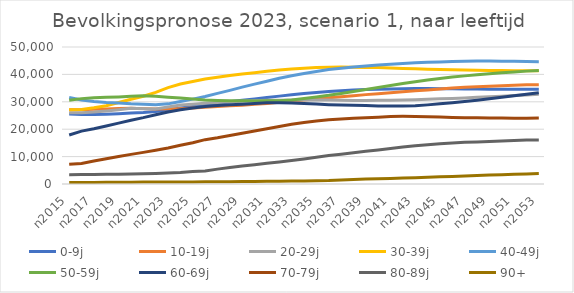
| Category | 0-9j | 10-19j | 20-29j | 30-39j | 40-49j | 50-59j | 60-69j | 70-79j | 80-89j | 90+ |
|---|---|---|---|---|---|---|---|---|---|---|
| n2015 | 25526 | 27094 | 26007 | 27068 | 31578 | 30590 | 17898 | 7209 | 3403 | 562 |
| n2016 | 25325 | 27142 | 26029 | 27207 | 30656 | 31159 | 19295 | 7473 | 3446 | 570 |
| n2017 | 25367 | 27279 | 26249 | 27825 | 30104 | 31476 | 20166 | 8390 | 3483 | 581 |
| n2018 | 25470 | 27389 | 26666 | 28563 | 29717 | 31651 | 21172 | 9244 | 3537 | 622 |
| n2019 | 25660 | 27536 | 27139 | 29739 | 29534 | 31796 | 22206 | 10050 | 3562 | 676 |
| n2020 | 25937 | 27640 | 27601 | 30940 | 29255 | 32040 | 23262 | 10810 | 3691 | 668 |
| n2021 | 26102 | 27509 | 27504 | 32044 | 29095 | 32231 | 24217 | 11540 | 3772 | 697 |
| n2022 | 26485 | 27369 | 27417 | 33447 | 28892 | 32028 | 25301 | 12310 | 3857 | 696 |
| n2023 | 27070 | 27462 | 28101 | 35198 | 29247 | 31656 | 26243 | 13155 | 4016 | 696 |
| n2024 | 27778 | 27497 | 28821 | 36497 | 30107 | 31380 | 27061 | 14138 | 4237 | 735 |
| n2025 | 28300 | 27695 | 29083 | 37405 | 30979 | 31008 | 27765 | 15071 | 4564 | 757 |
| n2026 | 28857 | 27982 | 29444 | 38289 | 31952 | 30693 | 28281 | 16186 | 4768 | 788 |
| n2027 | 29411 | 28272 | 29735 | 38963 | 33080 | 30513 | 28666 | 16860 | 5427 | 819 |
| n2028 | 29994 | 28521 | 29986 | 39611 | 34177 | 30428 | 28880 | 17669 | 6008 | 845 |
| n2029 | 30574 | 28782 | 30176 | 40132 | 35362 | 30379 | 29075 | 18496 | 6540 | 889 |
| n2030 | 31045 | 29121 | 30387 | 40637 | 36451 | 30296 | 29364 | 19321 | 7036 | 940 |
| n2031 | 31600 | 29395 | 30523 | 41138 | 37485 | 30340 | 29635 | 20136 | 7547 | 970 |
| n2032 | 32074 | 29830 | 30581 | 41593 | 38584 | 30396 | 29666 | 21020 | 8066 | 1015 |
| n2033 | 32563 | 30205 | 30647 | 41981 | 39541 | 30663 | 29568 | 21820 | 8583 | 1070 |
| n2034 | 33004 | 30668 | 30612 | 42273 | 40350 | 31176 | 29386 | 22449 | 9164 | 1135 |
| n2035 | 33411 | 31083 | 30686 | 42479 | 41071 | 31779 | 29157 | 23013 | 9739 | 1227 |
| n2036 | 33786 | 31456 | 30642 | 42650 | 41758 | 32366 | 28951 | 23439 | 10381 | 1279 |
| n2037 | 34068 | 31817 | 30556 | 42662 | 42244 | 33062 | 28798 | 23761 | 10853 | 1488 |
| n2038 | 34290 | 32216 | 30491 | 42638 | 42714 | 33749 | 28705 | 23958 | 11390 | 1652 |
| n2039 | 34458 | 32619 | 30479 | 42559 | 43077 | 34521 | 28623 | 24147 | 11920 | 1784 |
| n2040 | 34575 | 32958 | 30569 | 42473 | 43410 | 35250 | 28500 | 24395 | 12431 | 1902 |
| n2041 | 34695 | 33339 | 30559 | 42345 | 43731 | 35922 | 28466 | 24628 | 12925 | 2028 |
| n2042 | 34769 | 33665 | 30667 | 42189 | 44001 | 36670 | 28436 | 24682 | 13473 | 2156 |
| n2043 | 34809 | 34015 | 30769 | 42060 | 44246 | 37340 | 28562 | 24646 | 13957 | 2286 |
| n2044 | 34812 | 34348 | 30929 | 41914 | 44433 | 37921 | 28878 | 24551 | 14349 | 2446 |
| n2045 | 34778 | 34668 | 31097 | 41820 | 44564 | 38469 | 29247 | 24411 | 14714 | 2604 |
| n2046 | 34734 | 35000 | 31246 | 41684 | 44706 | 39023 | 29627 | 24297 | 14995 | 2774 |
| n2047 | 34694 | 35287 | 31423 | 41572 | 44803 | 39461 | 30104 | 24224 | 15217 | 2937 |
| n2048 | 34648 | 35519 | 31617 | 41470 | 44852 | 39887 | 30587 | 24173 | 15371 | 3102 |
| n2049 | 34614 | 35717 | 31827 | 41403 | 44857 | 40236 | 31146 | 24125 | 15520 | 3256 |
| n2050 | 34600 | 35875 | 32027 | 41389 | 44838 | 40573 | 31686 | 24050 | 15719 | 3391 |
| n2051 | 34563 | 36048 | 32274 | 41314 | 44786 | 40903 | 32199 | 24036 | 15919 | 3526 |
| n2052 | 34548 | 36179 | 32518 | 41304 | 44717 | 41196 | 32777 | 24023 | 16022 | 3691 |
| n2053 | 34558 | 36263 | 32784 | 41323 | 44650 | 41453 | 33310 | 24125 | 16059 | 3826 |